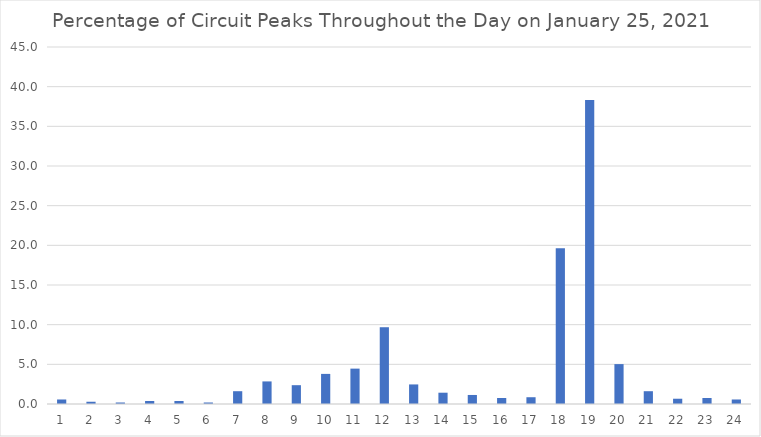
| Category | Series 0 |
|---|---|
| 0 | 0.569 |
| 1 | 0.285 |
| 2 | 0.19 |
| 3 | 0.38 |
| 4 | 0.38 |
| 5 | 0.19 |
| 6 | 1.613 |
| 7 | 2.846 |
| 8 | 2.372 |
| 9 | 3.795 |
| 10 | 4.459 |
| 11 | 9.677 |
| 12 | 2.467 |
| 13 | 1.423 |
| 14 | 1.139 |
| 15 | 0.759 |
| 16 | 0.854 |
| 17 | 19.639 |
| 18 | 38.33 |
| 19 | 5.028 |
| 20 | 1.613 |
| 21 | 0.664 |
| 22 | 0.759 |
| 23 | 0.569 |